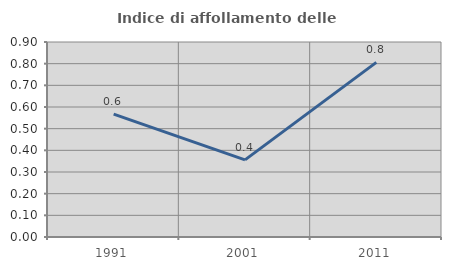
| Category | Indice di affollamento delle abitazioni  |
|---|---|
| 1991.0 | 0.567 |
| 2001.0 | 0.356 |
| 2011.0 | 0.806 |